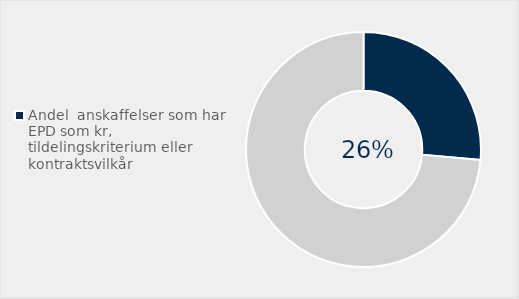
| Category | Series 0 |
|---|---|
| Andel  anskaffelser som har EPD som kr, tildelingskriterium eller kontraktsvilkår | 0.264 |
| Ikke brukt EPD | 0.736 |